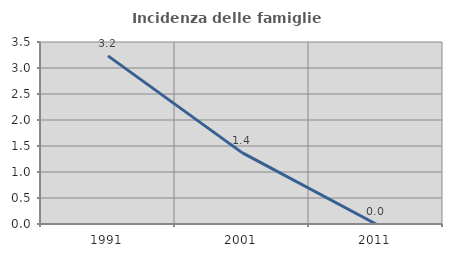
| Category | Incidenza delle famiglie numerose |
|---|---|
| 1991.0 | 3.233 |
| 2001.0 | 1.373 |
| 2011.0 | 0 |